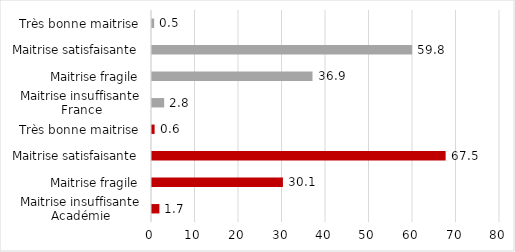
| Category | Series 0 |
|---|---|
| 0 | 1.7 |
| 1 | 30.1 |
| 2 | 67.5 |
| 3 | 0.6 |
| 4 | 2.8 |
| 5 | 36.9 |
| 6 | 59.8 |
| 7 | 0.5 |